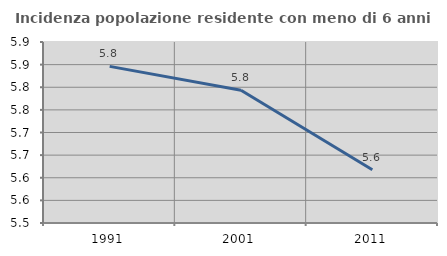
| Category | Incidenza popolazione residente con meno di 6 anni |
|---|---|
| 1991.0 | 5.846 |
| 2001.0 | 5.794 |
| 2011.0 | 5.618 |